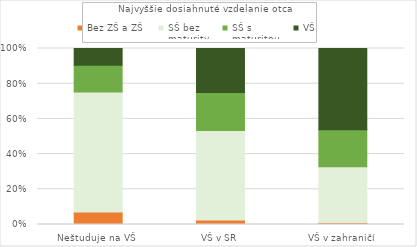
| Category | Bez ZŠ a ZŠ | SŠ bez
maturity | SŠ s
maturitou | VŠ |
|---|---|---|---|---|
| Neštuduje na VŠ | 952 | 9115 | 2033 | 1266 |
| VŠ v SR | 422 | 8208 | 3479 | 4034 |
| VŠ v zahraničí | 36 | 1038 | 686 | 1513 |